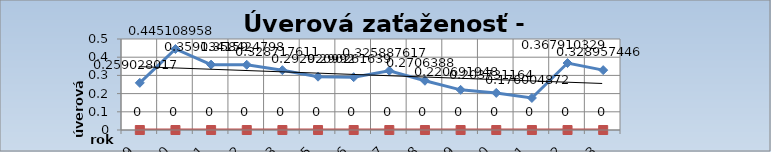
| Category | Series 0 | Series 1 |
|---|---|---|
| 2009.0 | 0.259 |  |
| 2010.0 | 0.445 |  |
| 2011.0 | 0.359 |  |
| 2012.0 | 0.358 |  |
| 2013.0 | 0.329 |  |
| 2015.0 | 0.293 |  |
| 2016.0 | 0.29 |  |
| 2017.0 | 0.326 |  |
| 2018.0 | 0.271 |  |
| 2019.0 | 0.221 |  |
| 2020.0 | 0.204 |  |
| 2021.0 | 0.176 |  |
| 2022.0 | 0.368 |  |
| 2023.0 | 0.329 |  |